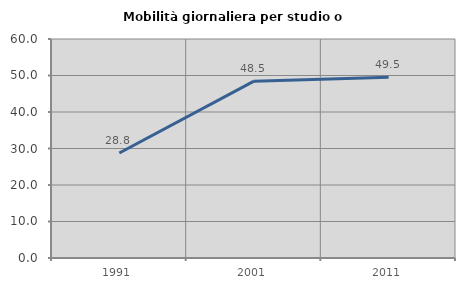
| Category | Mobilità giornaliera per studio o lavoro |
|---|---|
| 1991.0 | 28.758 |
| 2001.0 | 48.454 |
| 2011.0 | 49.505 |